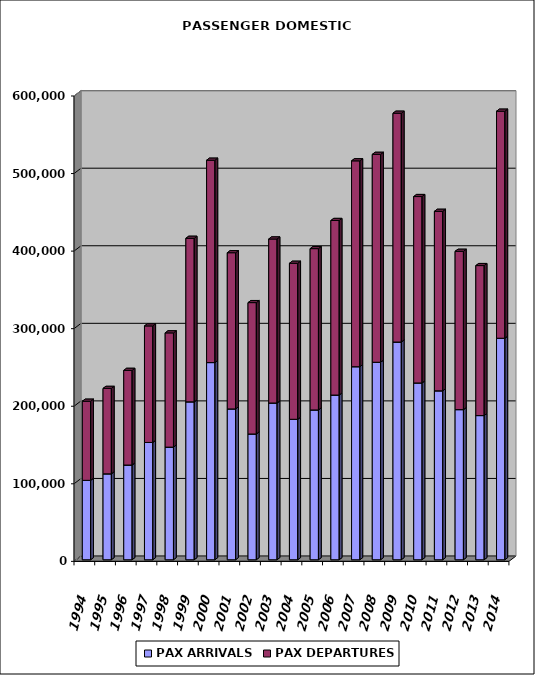
| Category | PAX ARRIVALS | PAX DEPARTURES |
|---|---|---|
| 1994.0 | 102386 | 101974 |
| 1995.0 | 110777 | 110133 |
| 1996.0 | 122136 | 122010 |
| 1997.0 | 151231 | 150240 |
| 1998.0 | 145216 | 147288 |
| 1999.0 | 203598 | 210831 |
| 2000.0 | 254231 | 260862 |
| 2001.0 | 194480 | 201384 |
| 2002.0 | 162173 | 169348 |
| 2003.0 | 202107 | 211434 |
| 2004.0 | 181122 | 201102 |
| 2005.0 | 193179 | 207962 |
| 2006.0 | 212376 | 225027 |
| 2007.0 | 248906 | 265412 |
| 2008.0 | 254659 | 267999 |
| 2009.0 | 280717 | 294970 |
| 2010.0 | 227956 | 240323 |
| 2011.0 | 217817 | 231394 |
| 2012.0 | 193565 | 204096 |
| 2013.0 | 185888 | 193392 |
| 2014.0 | 285611 | 292675 |